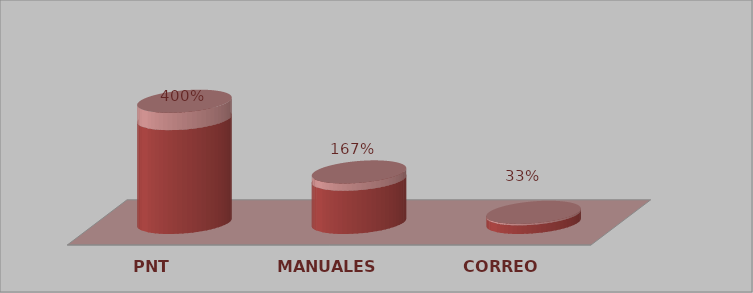
| Category | Series 0 | Series 1 |
|---|---|---|
| PNT | 24 | 4 |
| MANUALES | 10 | 1.667 |
| CORREO | 2 | 0.333 |